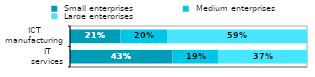
| Category |  Small enterprises |  Medium enterprises |  Large enterprises |
|---|---|---|---|
|  IT 
services | 0.432 | 0.195 | 0.373 |
|  ICT 
manufacturing | 0.213 | 0.197 | 0.591 |